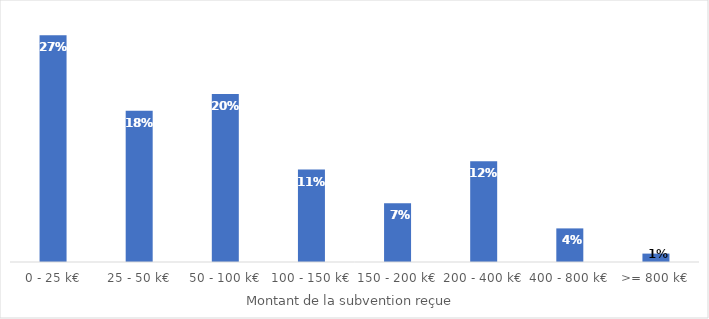
| Category | Part des subventions (en %) |
|---|---|
| 0 - 25 k€ | 0.27 |
| 25 - 50 k€ | 0.18 |
| 50 - 100 k€ | 0.2 |
| 100 - 150 k€ | 0.11 |
| 150 - 200 k€ | 0.07 |
| 200 - 400 k€ | 0.12 |
| 400 - 800 k€ | 0.04 |
| >= 800 k€ | 0.01 |